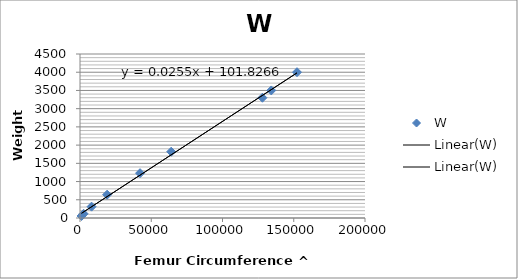
| Category | W |
|---|---|
| 1092.7270000000003 | 55 |
| 2515.4559999999997 | 115 |
| 8120.6010000000015 | 311 |
| 19034.163 | 640 |
| 42144.19199999999 | 1230 |
| 64000.0 | 1818 |
| 128024.06399999998 | 3300 |
| 134217.72800000003 | 3500 |
| 152273.304 | 4000 |